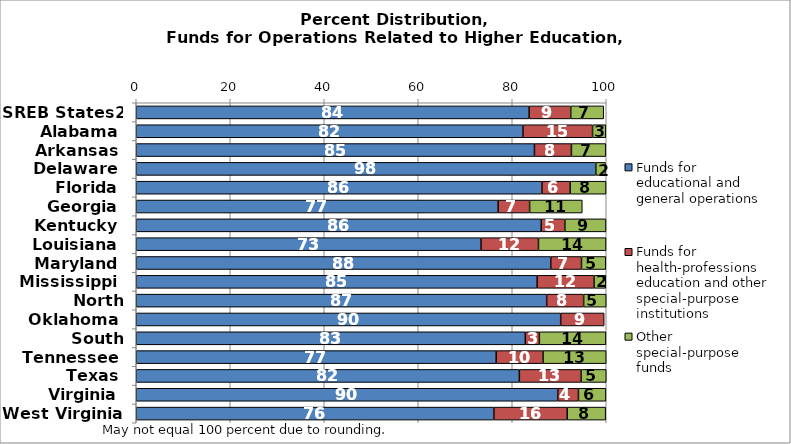
| Category | Funds for educational and general operations | Funds for health-professions education and other special-purpose institutions | Other special-purpose funds |
|---|---|---|---|
| SREB States2 | 83.582 | 8.862 | 7.012 |
| Alabama | 82.278 | 14.812 | 2.814 |
| Arkansas | 84.724 | 7.868 | 7.319 |
| Delaware | 97.784 | 0 | 2.043 |
| Florida | 86.316 | 6 | 7.639 |
| Georgia | 76.992 | 6.701 | 11.208 |
| Kentucky | 86.164 | 5.034 | 8.742 |
| Louisiana | 73.354 | 12.227 | 14.371 |
| Maryland | 88.198 | 6.534 | 5.173 |
| Mississippi | 85.284 | 12.126 | 2.496 |
| North Carolina | 87.324 | 7.868 | 4.804 |
| Oklahoma | 90.306 | 9.252 | 0 |
| South Carolina | 82.776 | 2.993 | 14.158 |
| Tennessee | 76.576 | 9.978 | 13.432 |
| Texas | 81.51 | 13.132 | 5.358 |
| Virginia | 89.676 | 4.407 | 5.843 |
| West Virginia | 76.095 | 15.596 | 8.187 |